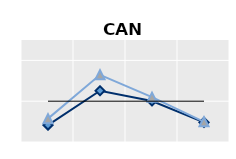
| Category | Né à l'étranger | Né dans le pays | Series 1 |
|---|---|---|---|
| 15-24 | 0.413 | 0.573 | 1 |
| 25-54 | 1.257 | 1.647 | 1 |
| 55-64 | 1.005 | 1.1 | 1 |
| 65+ | 0.482 | 0.494 | 1 |